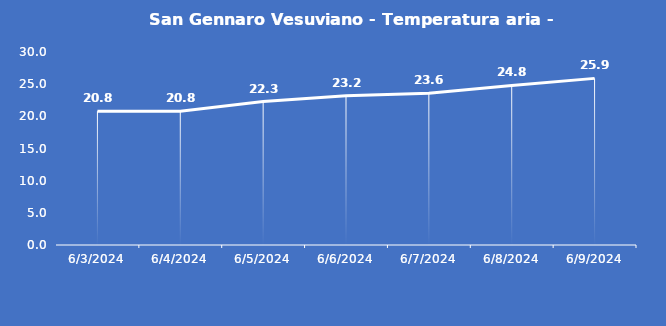
| Category | San Gennaro Vesuviano - Temperatura aria - Grezzo (°C) |
|---|---|
| 6/3/24 | 20.8 |
| 6/4/24 | 20.8 |
| 6/5/24 | 22.3 |
| 6/6/24 | 23.2 |
| 6/7/24 | 23.6 |
| 6/8/24 | 24.8 |
| 6/9/24 | 25.9 |